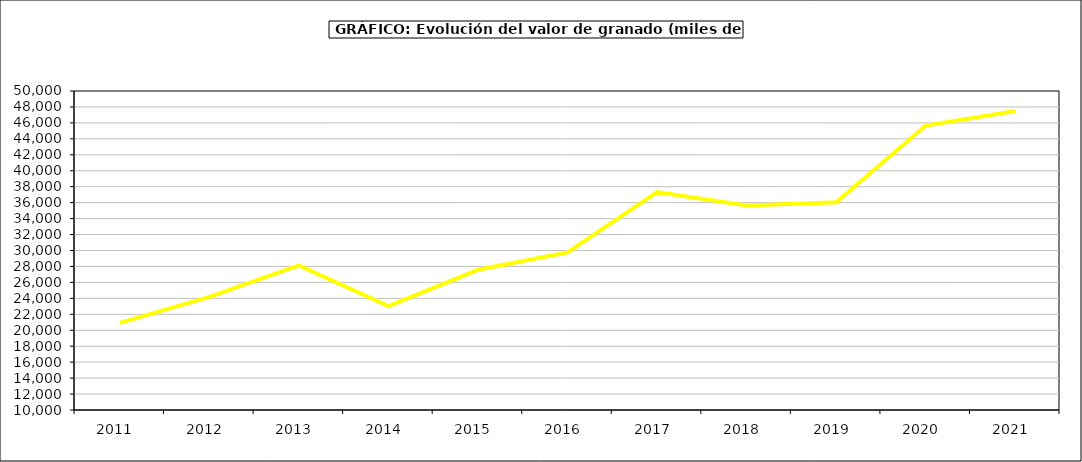
| Category | valor granado |
|---|---|
| 2011.0 | 20923.27 |
| 2012.0 | 24185.236 |
| 2013.0 | 28138.938 |
| 2014.0 | 23031.365 |
| 2015.0 | 27581 |
| 2016.0 | 29763 |
| 2017.0 | 37333.028 |
| 2018.0 | 35641.983 |
| 2019.0 | 36035.866 |
| 2020.0 | 45669.441 |
| 2021.0 | 47492.969 |